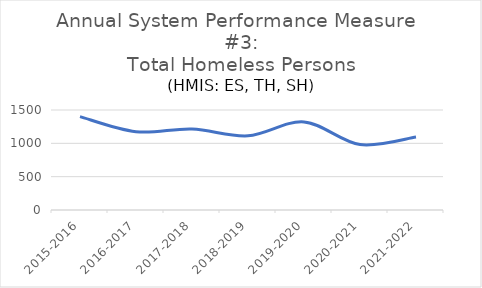
| Category | Total Persons (SPM) |
|---|---|
| 2015-2016 | 1400 |
| 2016-2017 | 1174 |
| 2017-2018 | 1214 |
| 2018-2019 | 1113 |
| 2019-2020 | 1321 |
| 2020-2021 | 982 |
| 2021-2022 | 1094 |